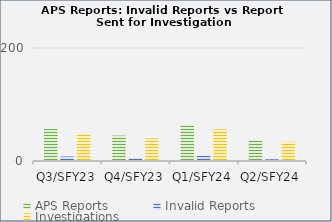
| Category | APS Reports | Invalid Reports | Investigations |
|---|---|---|---|
| Q3/SFY23 | 57 | 8 | 49 |
| Q4/SFY23 | 45 | 5 | 40 |
| Q1/SFY24 | 65 | 9 | 56 |
| Q2/SFY24 | 37 | 3 | 34 |